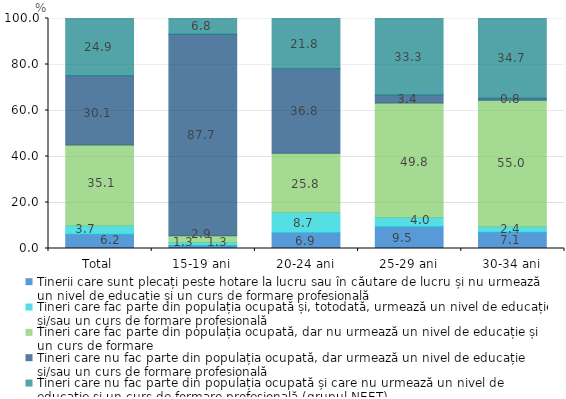
| Category | Tinerii care sunt plecați peste hotare la lucru sau în căutare de lucru și nu urmează un nivel de educație și un curs de formare profesională | Tineri care fac parte din populația ocupată și, totodată, urmează un nivel de educație și/sau un curs de formare profesională | Tineri care fac parte din populația ocupată, dar nu urmează un nivel de educație și un curs de formare | Tineri care nu fac parte din populația ocupată, dar urmează un nivel de educație și/sau un curs de formare profesională | Tineri care nu fac parte din populația ocupată și care nu urmează un nivel de educație și un curs de formare profesională (grupul NEET) |
|---|---|---|---|---|---|
| Total | 6.2 | 3.7 | 35.1 | 30.1 | 24.9 |
| 15-19 ani | 1.3 | 1.3 | 2.9 | 87.7 | 6.8 |
| 20-24 ani | 6.9 | 8.7 | 25.8 | 36.8 | 21.8 |
| 25-29 ani | 9.5 | 4 | 49.8 | 3.4 | 33.3 |
| 30-34 ani | 7.1 | 2.4 | 55 | 0.8 | 34.7 |